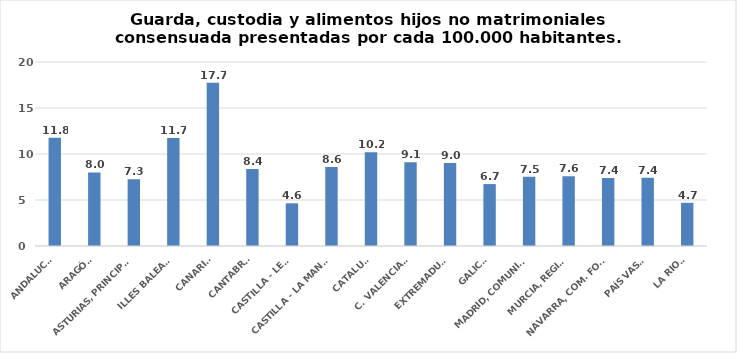
| Category | Series 0 |
|---|---|
| ANDALUCÍA | 11.776 |
| ARAGÓN | 7.998 |
| ASTURIAS, PRINCIPADO | 7.267 |
| ILLES BALEARS | 11.732 |
| CANARIAS | 17.736 |
| CANTABRIA | 8.373 |
| CASTILLA - LEÓN | 4.641 |
| CASTILLA - LA MANCHA | 8.576 |
| CATALUÑA | 10.201 |
| C. VALENCIANA | 9.095 |
| EXTREMADURA | 9.011 |
| GALICIA | 6.731 |
| MADRID, COMUNIDAD | 7.532 |
| MURCIA, REGIÓN | 7.575 |
| NAVARRA, COM. FORAL | 7.384 |
| PAÍS VASCO | 7.43 |
| LA RIOJA | 4.695 |